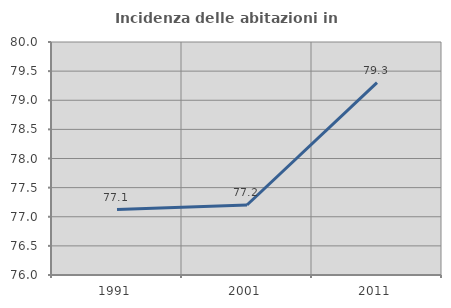
| Category | Incidenza delle abitazioni in proprietà  |
|---|---|
| 1991.0 | 77.124 |
| 2001.0 | 77.202 |
| 2011.0 | 79.304 |